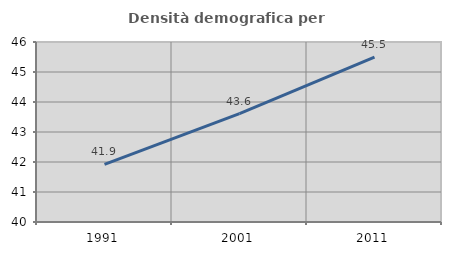
| Category | Densità demografica |
|---|---|
| 1991.0 | 41.92 |
| 2001.0 | 43.612 |
| 2011.0 | 45.497 |